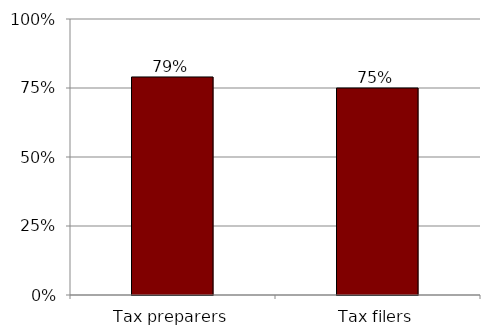
| Category | Series 0 |
|---|---|
| Tax preparers | 0.79 |
| Tax filers | 0.75 |